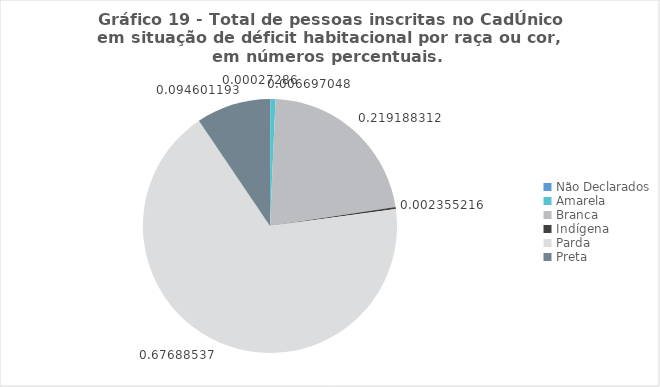
| Category | Series 0 |
|---|---|
| Não Declarados | 0 |
| Amarela | 0.007 |
| Branca | 0.219 |
| Indígena | 0.002 |
| Parda | 0.677 |
| Preta | 0.095 |